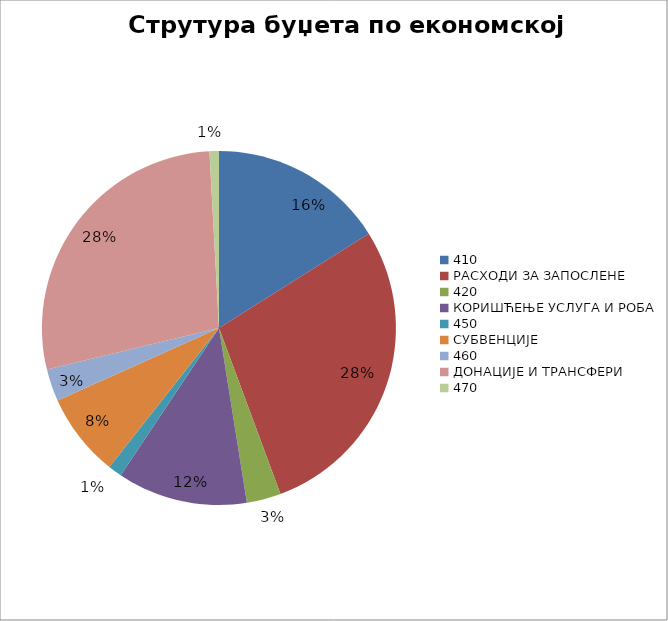
| Category | Series 0 |
|---|---|
| 0 | 130680000 |
| 1 | 230440000 |
| 2 | 25450000 |
| 3 | 96850000 |
| 4 | 10300000 |
| 5 | 62170359 |
| 6 | 23997641 |
| 7 | 227302000 |
| 8 | 7000000 |